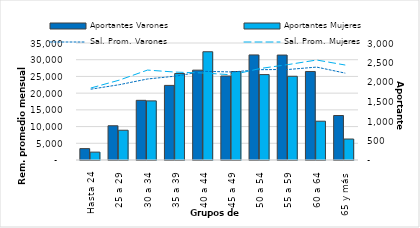
| Category | Aportantes Varones | Aportantes Mujeres |
|---|---|---|
| Hasta 24 | 292 | 202 |
| 25 a 29 | 878 | 763 |
| 30 a 34 | 1530 | 1516 |
| 35 a 39 | 1913 | 2217 |
| 40 a 44 | 2304 | 2776 |
| 45 a 49 | 2153 | 2269 |
| 50 a 54 | 2694 | 2190 |
| 55 a 59 | 2691 | 2147 |
| 60 a 64 | 2270 | 995 |
| 65 y más | 1141 | 538 |